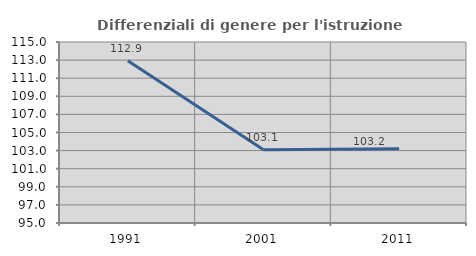
| Category | Differenziali di genere per l'istruzione superiore |
|---|---|
| 1991.0 | 112.936 |
| 2001.0 | 103.093 |
| 2011.0 | 103.213 |